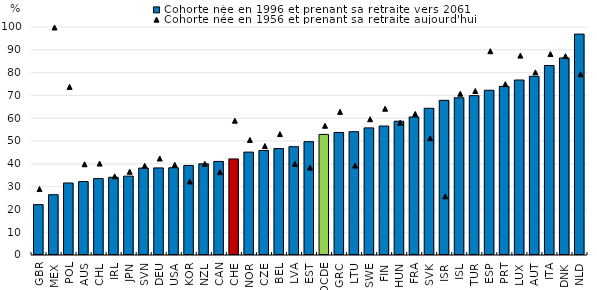
| Category | Cohorte née en 1996 et prenant sa retraite vers 2061 |
|---|---|
| GBR | 22.1 |
| MEX | 26.444 |
| POL | 31.58 |
| AUS | 32.203 |
| CHL | 33.516 |
| IRL | 34.085 |
| JPN | 34.584 |
| SVN | 38.109 |
| DEU | 38.197 |
| USA | 38.259 |
| KOR | 39.268 |
| NZL | 39.998 |
| CAN | 41.046 |
| CHE | 42.144 |
| NOR | 45.123 |
| CZE | 45.843 |
| BEL | 46.678 |
| LVA | 47.503 |
| EST | 49.695 |
| OCDE | 52.9 |
| GRC | 53.738 |
| LTU | 54.075 |
| SWE | 55.751 |
| FIN | 56.56 |
| HUN | 58.676 |
| FRA | 60.535 |
| SVK | 64.349 |
| ISR | 67.836 |
| ISL | 68.955 |
| TUR | 69.885 |
| ESP | 72.258 |
| PRT | 73.959 |
| LUX | 76.746 |
| AUT | 78.378 |
| ITA | 83.104 |
| DNK | 86.423 |
| NLD | 96.882 |